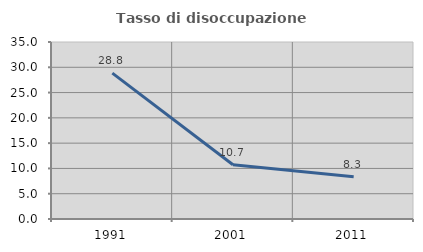
| Category | Tasso di disoccupazione giovanile  |
|---|---|
| 1991.0 | 28.846 |
| 2001.0 | 10.714 |
| 2011.0 | 8.333 |